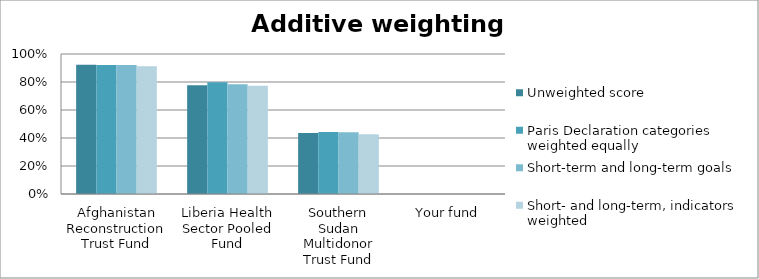
| Category | Unweighted score | Paris Declaration categories weighted equally | Short-term and long-term goals | Short- and long-term, indicators weighted |
|---|---|---|---|---|
| Afghanistan Reconstruction Trust Fund | 0.924 | 0.921 | 0.922 | 0.913 |
| Liberia Health Sector Pooled Fund | 0.777 | 0.799 | 0.783 | 0.774 |
| Southern Sudan Multidonor Trust Fund | 0.436 | 0.442 | 0.441 | 0.428 |
| Your fund | 0 | 0 | 0 | 0 |